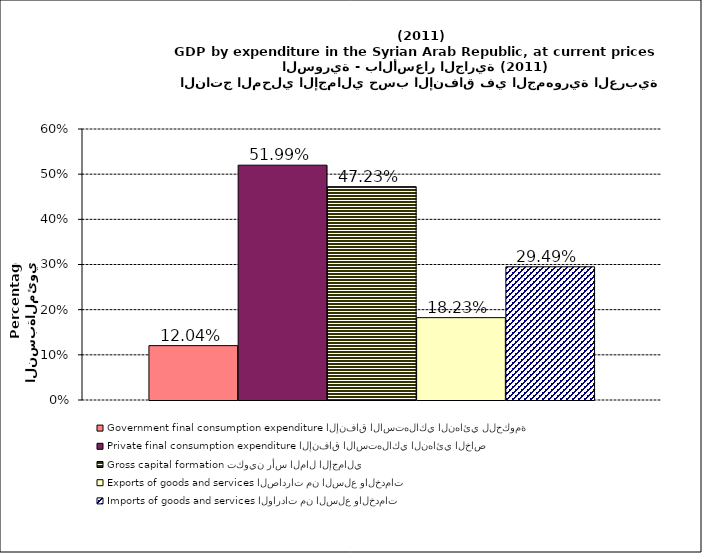
| Category | Government final consumption expenditure الإنفاق الاستهلاكي النهائي للحكومة | Private final consumption expenditure الإنفاق الاستهلاكي النهائي الخاص | Gross capital formation تكوين رأس المال الإجمالي | Exports of goods and services الصادرات من السلع والخدمات | Imports of goods and services الواردات من السلع والخدمات |
|---|---|---|---|---|---|
| 0 | 0.12 | 0.52 | 0.472 | 0.182 | 0.295 |